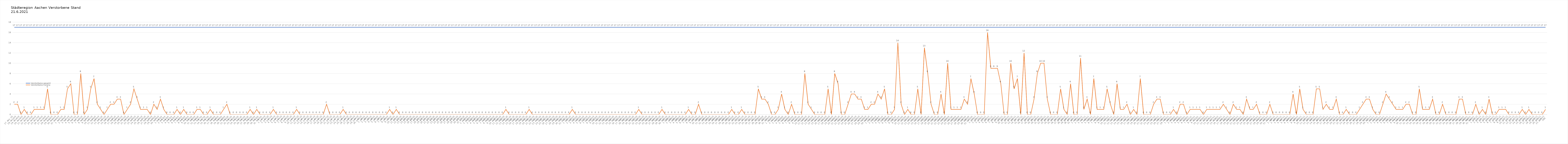
| Category | Verstorbene gesamt | Verstorbene Corona |
|---|---|---|
| 0 | 17 | 2 |
| 1 | 17 | 2 |
| 2 | 17 | 0 |
| 3 | 17 | 1 |
| 4 | 17 | 0 |
| 5 | 17 | 0 |
| 6 | 17 | 1 |
| 7 | 17 | 1 |
| 8 | 17 | 1 |
| 9 | 17 | 1 |
| 10 | 17 | 5 |
| 11 | 17 | 0 |
| 12 | 17 | 0 |
| 13 | 17 | 0 |
| 14 | 17 | 1 |
| 15 | 17 | 1 |
| 16 | 17 | 5 |
| 17 | 17 | 6 |
| 18 | 17 | 0 |
| 19 | 17 | 0 |
| 20 | 17 | 8 |
| 21 | 17 | 0 |
| 22 | 17 | 1 |
| 23 | 17 | 5 |
| 24 | 17 | 7 |
| 25 | 17 | 2 |
| 26 | 17 | 1 |
| 27 | 17 | 0 |
| 28 | 17 | 1 |
| 29 | 17 | 2 |
| 30 | 17 | 2 |
| 31 | 17 | 3 |
| 32 | 17 | 3 |
| 33 | 17 | 0 |
| 34 | 17 | 1 |
| 35 | 17 | 2 |
| 36 | 17 | 5 |
| 37 | 17 | 3 |
| 38 | 17 | 1 |
| 39 | 17 | 1 |
| 40 | 17 | 1 |
| 41 | 17 | 0 |
| 42 | 17 | 2 |
| 43 | 17 | 1 |
| 44 | 17 | 3 |
| 45 | 17 | 1 |
| 46 | 17 | 0 |
| 47 | 17 | 0 |
| 48 | 17 | 0 |
| 49 | 17 | 1 |
| 50 | 17 | 0 |
| 51 | 17 | 1 |
| 52 | 17 | 0 |
| 53 | 17 | 0 |
| 54 | 17 | 0 |
| 55 | 17 | 1 |
| 56 | 17 | 1 |
| 57 | 17 | 0 |
| 58 | 17 | 0 |
| 59 | 17 | 1 |
| 60 | 17 | 0 |
| 61 | 17 | 0 |
| 62 | 17 | 0 |
| 63 | 17 | 1 |
| 64 | 17 | 2 |
| 65 | 17 | 0 |
| 66 | 17 | 0 |
| 67 | 17 | 0 |
| 68 | 17 | 0 |
| 69 | 17 | 0 |
| 70 | 17 | 0 |
| 71 | 17 | 1 |
| 72 | 17 | 0 |
| 73 | 17 | 1 |
| 74 | 17 | 0 |
| 75 | 17 | 0 |
| 76 | 17 | 0 |
| 77 | 17 | 0 |
| 78 | 17 | 1 |
| 79 | 17 | 0 |
| 80 | 17 | 0 |
| 81 | 17 | 0 |
| 82 | 17 | 0 |
| 83 | 17 | 0 |
| 84 | 17 | 0 |
| 85 | 17 | 1 |
| 86 | 17 | 0 |
| 87 | 17 | 0 |
| 88 | 17 | 0 |
| 89 | 17 | 0 |
| 90 | 17 | 0 |
| 91 | 17 | 0 |
| 92 | 17 | 0 |
| 93 | 17 | 0 |
| 94 | 17 | 2 |
| 95 | 17 | 0 |
| 96 | 17 | 0 |
| 97 | 17 | 0 |
| 98 | 17 | 0 |
| 99 | 17 | 1 |
| 100 | 17 | 0 |
| 101 | 17 | 0 |
| 102 | 17 | 0 |
| 103 | 17 | 0 |
| 104 | 17 | 0 |
| 105 | 17 | 0 |
| 106 | 17 | 0 |
| 107 | 17 | 0 |
| 108 | 17 | 0 |
| 109 | 17 | 0 |
| 110 | 17 | 0 |
| 111 | 17 | 0 |
| 112 | 17 | 0 |
| 113 | 17 | 1 |
| 114 | 17 | 0 |
| 115 | 17 | 1 |
| 116 | 17 | 0 |
| 117 | 17 | 0 |
| 118 | 17 | 0 |
| 119 | 17 | 0 |
| 120 | 17 | 0 |
| 121 | 17 | 0 |
| 122 | 17 | 0 |
| 123 | 17 | 0 |
| 124 | 17 | 0 |
| 125 | 17 | 0 |
| 126 | 17 | 0 |
| 127 | 17 | 0 |
| 128 | 17 | 0 |
| 129 | 17 | 0 |
| 130 | 17 | 0 |
| 131 | 17 | 0 |
| 132 | 17 | 0 |
| 133 | 17 | 0 |
| 134 | 17 | 0 |
| 135 | 17 | 0 |
| 136 | 17 | 0 |
| 137 | 17 | 0 |
| 138 | 17 | 0 |
| 139 | 17 | 0 |
| 140 | 17 | 0 |
| 141 | 17 | 0 |
| 142 | 17 | 0 |
| 143 | 17 | 0 |
| 144 | 17 | 0 |
| 145 | 17 | 0 |
| 146 | 17 | 0 |
| 147 | 17 | 0 |
| 148 | 17 | 1 |
| 149 | 17 | 0 |
| 150 | 17 | 0 |
| 151 | 17 | 0 |
| 152 | 17 | 0 |
| 153 | 17 | 0 |
| 154 | 17 | 0 |
| 155 | 17 | 1 |
| 156 | 17 | 0 |
| 157 | 17 | 0 |
| 158 | 17 | 0 |
| 159 | 17 | 0 |
| 160 | 17 | 0 |
| 161 | 17 | 0 |
| 162 | 17 | 0 |
| 163 | 17 | 0 |
| 164 | 17 | 0 |
| 165 | 17 | 0 |
| 166 | 17 | 0 |
| 167 | 17 | 0 |
| 168 | 17 | 1 |
| 169 | 17 | 0 |
| 170 | 17 | 0 |
| 171 | 17 | 0 |
| 172 | 17 | 0 |
| 173 | 17 | 0 |
| 174 | 17 | 0 |
| 175 | 17 | 0 |
| 176 | 17 | 0 |
| 177 | 17 | 0 |
| 178 | 17 | 0 |
| 179 | 17 | 0 |
| 180 | 17 | 0 |
| 181 | 17 | 0 |
| 182 | 17 | 0 |
| 183 | 17 | 0 |
| 184 | 17 | 0 |
| 185 | 17 | 0 |
| 186 | 17 | 0 |
| 187 | 17 | 0 |
| 188 | 17 | 1 |
| 189 | 17 | 0 |
| 190 | 17 | 0 |
| 191 | 17 | 0 |
| 192 | 17 | 0 |
| 193 | 17 | 0 |
| 194 | 17 | 0 |
| 195 | 17 | 1 |
| 196 | 17 | 0 |
| 197 | 17 | 0 |
| 198 | 17 | 0 |
| 199 | 17 | 0 |
| 200 | 17 | 0 |
| 201 | 17 | 0 |
| 202 | 17 | 0 |
| 203 | 17 | 1 |
| 204 | 17 | 0 |
| 205 | 17 | 0 |
| 206 | 17 | 2 |
| 207 | 17 | 0 |
| 208 | 17 | 0 |
| 209 | 17 | 0 |
| 210 | 17 | 0 |
| 211 | 17 | 0 |
| 212 | 17 | 0 |
| 213 | 17 | 0 |
| 214 | 17 | 0 |
| 215 | 17 | 0 |
| 216 | 17 | 1 |
| 217 | 17 | 0 |
| 218 | 17 | 0 |
| 219 | 17 | 1 |
| 220 | 17 | 0 |
| 221 | 17 | 0 |
| 222 | 17 | 0 |
| 223 | 17 | 0 |
| 224 | 17 | 5 |
| 225 | 17 | 3 |
| 226 | 17 | 3 |
| 227 | 17 | 2 |
| 228 | 17 | 0 |
| 229 | 17 | 0 |
| 230 | 17 | 1 |
| 231 | 17 | 4 |
| 232 | 17 | 1 |
| 233 | 17 | 0 |
| 234 | 17 | 2 |
| 235 | 17 | 0 |
| 236 | 17 | 0 |
| 237 | 17 | 0 |
| 238 | 17 | 8 |
| 239 | 17 | 2 |
| 240 | 17 | 1 |
| 241 | 17 | 0 |
| 242 | 17 | 0 |
| 243 | 17 | 0 |
| 244 | 17 | 0 |
| 245 | 17 | 5 |
| 246 | 17 | 0 |
| 247 | 17 | 8 |
| 248 | 17 | 6 |
| 249 | 17 | 0 |
| 250 | 17 | 0 |
| 251 | 17 | 2 |
| 252 | 17 | 4 |
| 253 | 17 | 4 |
| 254 | 17 | 3 |
| 255 | 17 | 3 |
| 256 | 17 | 1 |
| 257 | 17 | 1 |
| 258 | 17 | 2 |
| 259 | 17 | 2 |
| 260 | 17 | 4 |
| 261 | 17 | 3 |
| 262 | 17 | 5 |
| 263 | 17 | 0 |
| 264 | 17 | 0 |
| 265 | 17 | 1 |
| 266 | 17 | 14 |
| 267 | 17 | 2 |
| 268 | 17 | 0 |
| 269 | 17 | 1 |
| 270 | 17 | 0 |
| 271 | 17 | 0 |
| 272 | 17 | 5 |
| 273 | 17 | 0 |
| 274 | 17 | 13 |
| 275 | 17 | 8 |
| 276 | 17 | 2 |
| 277 | 17 | 0 |
| 278 | 17 | 0 |
| 279 | 17 | 4 |
| 280 | 17 | 0 |
| 281 | 17 | 10 |
| 282 | 17 | 1 |
| 283 | 17 | 1 |
| 284 | 17 | 1 |
| 285 | 17 | 1 |
| 286 | 17 | 3 |
| 287 | 17 | 2 |
| 288 | 17 | 7 |
| 289 | 17 | 4 |
| 290 | 17 | 0 |
| 291 | 17 | 0 |
| 292 | 17 | 0 |
| 293 | 17 | 16 |
| 294 | 17 | 9 |
| 295 | 17 | 9 |
| 296 | 17 | 9 |
| 297 | 17 | 6 |
| 298 | 17 | 0 |
| 299 | 17 | 0 |
| 300 | 17 | 10 |
| 301 | 17 | 5 |
| 302 | 17 | 7 |
| 303 | 17 | 0 |
| 304 | 17 | 12 |
| 305 | 17 | 0 |
| 306 | 17 | 0 |
| 307 | 17 | 3 |
| 308 | 17 | 8 |
| 309 | 17 | 10 |
| 310 | 17 | 10 |
| 311 | 17 | 3 |
| 312 | 17 | 0 |
| 313 | 17 | 0 |
| 314 | 17 | 0 |
| 315 | 17 | 5 |
| 316 | 17 | 1 |
| 317 | 17 | 0 |
| 318 | 17 | 6 |
| 319 | 17 | 0 |
| 320 | 17 | 0 |
| 321 | 17 | 11 |
| 322 | 17 | 1 |
| 323 | 17 | 3 |
| 324 | 17 | 0 |
| 325 | 17 | 7 |
| 326 | 17 | 1 |
| 327 | 17 | 1 |
| 328 | 17 | 1 |
| 329 | 17 | 5 |
| 330 | 17 | 2 |
| 331 | 17 | 0 |
| 332 | 17 | 6 |
| 333 | 17 | 1 |
| 334 | 17 | 1 |
| 335 | 17 | 2 |
| 336 | 17 | 0 |
| 337 | 17 | 1 |
| 338 | 17 | 0 |
| 339 | 17 | 7 |
| 340 | 17 | 0 |
| 341 | 17 | 0 |
| 342 | 17 | 0 |
| 343 | 17 | 2 |
| 344 | 17 | 3 |
| 345 | 17 | 3 |
| 346 | 17 | 0 |
| 347 | 17 | 0 |
| 348 | 17 | 0 |
| 349 | 17 | 1 |
| 350 | 17 | 0 |
| 351 | 17 | 2 |
| 352 | 17 | 2 |
| 353 | 17 | 0 |
| 354 | 17 | 1 |
| 355 | 17 | 1 |
| 356 | 17 | 1 |
| 357 | 17 | 1 |
| 358 | 17 | 0 |
| 359 | 17 | 1 |
| 360 | 17 | 1 |
| 361 | 17 | 1 |
| 362 | 17 | 1 |
| 363 | 17 | 1 |
| 364 | 17 | 2 |
| 365 | 17 | 1 |
| 366 | 17 | 0 |
| 367 | 17 | 2 |
| 368 | 17 | 1 |
| 369 | 17 | 1 |
| 370 | 17 | 0 |
| 371 | 17 | 3 |
| 372 | 17 | 1 |
| 373 | 17 | 1 |
| 374 | 17 | 2 |
| 375 | 17 | 0 |
| 376 | 17 | 0 |
| 377 | 17 | 0 |
| 378 | 17 | 2 |
| 379 | 17 | 0 |
| 380 | 17 | 0 |
| 381 | 17 | 0 |
| 382 | 17 | 0 |
| 383 | 17 | 0 |
| 384 | 17 | 0 |
| 385 | 17 | 4 |
| 386 | 17 | 0 |
| 387 | 17 | 5 |
| 388 | 17 | 1 |
| 389 | 17 | 0 |
| 390 | 17 | 0 |
| 391 | 17 | 0 |
| 392 | 17 | 5 |
| 393 | 17 | 5 |
| 394 | 17 | 1 |
| 395 | 17 | 2 |
| 396 | 17 | 1 |
| 397 | 17 | 1 |
| 398 | 17 | 3 |
| 399 | 17 | 0 |
| 400 | 17 | 0 |
| 401 | 17 | 1 |
| 402 | 17 | 0 |
| 403 | 17 | 0 |
| 404 | 17 | 0 |
| 405 | 17 | 1 |
| 406 | 17 | 2 |
| 407 | 17 | 3 |
| 408 | 17 | 3 |
| 409 | 17 | 1 |
| 410 | 17 | 0 |
| 411 | 17 | 0 |
| 412 | 17 | 2 |
| 413 | 17 | 4 |
| 414 | 17 | 3 |
| 415 | 17 | 2 |
| 416 | 17 | 1 |
| 417 | 17 | 1 |
| 418 | 17 | 1 |
| 419 | 17 | 2 |
| 420 | 17 | 2 |
| 421 | 17 | 0 |
| 422 | 17 | 0 |
| 423 | 17 | 5 |
| 424 | 17 | 1 |
| 425 | 17 | 1 |
| 426 | 17 | 1 |
| 427 | 17 | 3 |
| 428 | 17 | 0 |
| 429 | 17 | 0 |
| 430 | 17 | 2 |
| 431 | 17 | 0 |
| 432 | 17 | 0 |
| 433 | 17 | 0 |
| 434 | 17 | 0 |
| 435 | 17 | 3 |
| 436 | 17 | 3 |
| 437 | 17 | 0 |
| 438 | 17 | 0 |
| 439 | 17 | 0 |
| 440 | 17 | 2 |
| 441 | 17 | 0 |
| 442 | 17 | 1 |
| 443 | 17 | 0 |
| 444 | 17 | 3 |
| 445 | 17 | 0 |
| 446 | 17 | 0 |
| 447 | 17 | 1 |
| 448 | 17 | 1 |
| 449 | 17 | 1 |
| 450 | 17 | 0 |
| 451 | 17 | 0 |
| 452 | 17 | 0 |
| 453 | 17 | 0 |
| 454 | 17 | 1 |
| 455 | 17 | 0 |
| 456 | 17 | 1 |
| 457 | 17 | 0 |
| 458 | 17 | 0 |
| 459 | 17 | 0 |
| 460 | 17 | 0 |
| 461 | 17 | 1 |